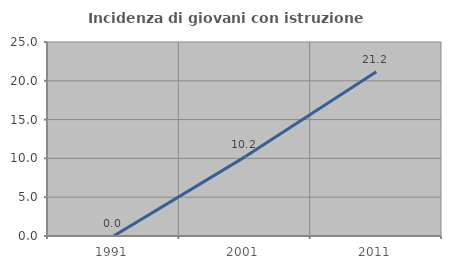
| Category | Incidenza di giovani con istruzione universitaria |
|---|---|
| 1991.0 | 0 |
| 2001.0 | 10.198 |
| 2011.0 | 21.166 |